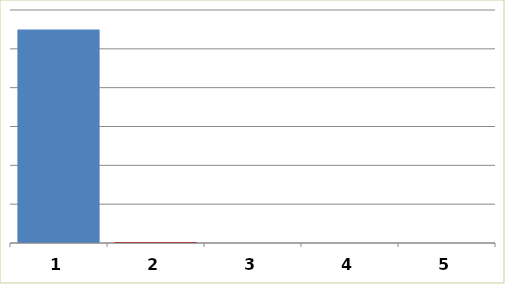
| Category | Series 0 |
|---|---|
| 0 | 1099594.8 |
| 1 | 5000 |
| 2 | 0 |
| 3 | 0 |
| 4 | 0 |